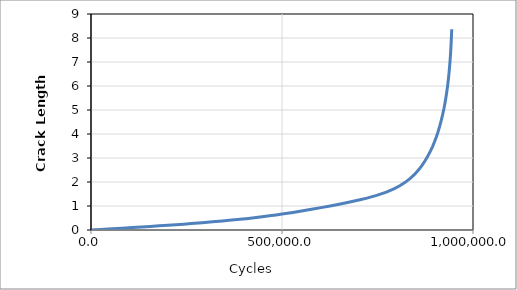
| Category | Series 0 |
|---|---|
| 0.0 | 0 |
| 26012.550499908713 | 0.022 |
| 55534.30999718615 | 0.05 |
| 81782.20482939767 | 0.075 |
| 108126.92658930192 | 0.101 |
| 132466.05350653693 | 0.125 |
| 154861.70012232166 | 0.148 |
| 178417.34925049936 | 0.173 |
| 201290.3176878568 | 0.197 |
| 222457.23201467452 | 0.22 |
| 242745.16798175607 | 0.243 |
| 262159.2345969868 | 0.266 |
| 291049.3199699309 | 0.303 |
| 318126.79382410855 | 0.339 |
| 343761.194375018 | 0.375 |
| 368113.61230577994 | 0.412 |
| 390320.32681070623 | 0.447 |
| 412346.0946539998 | 0.484 |
| 432218.4513562045 | 0.52 |
| 448110.0375029715 | 0.551 |
| 467069.9651072227 | 0.59 |
| 484347.52869853715 | 0.628 |
| 500178.7467167271 | 0.664 |
| 528535.9872325312 | 0.733 |
| 554863.696614153 | 0.802 |
| 581308.58593923 | 0.873 |
| 605787.4793314268 | 0.942 |
| 629718.4611966107 | 1.014 |
| 652650.4719789667 | 1.086 |
| 674414.8182130293 | 1.157 |
| 704175.7588909321 | 1.261 |
| 722334.0298323616 | 1.33 |
| 747801.3628681198 | 1.442 |
| 773169.672937927 | 1.58 |
| 792737.3144612974 | 1.714 |
| 808467.7342661566 | 1.844 |
| 821492.4113012028 | 1.974 |
| 835738.2564782317 | 2.148 |
| 847533.5622840098 | 2.325 |
| 857689.6345287347 | 2.506 |
| 866595.5892198187 | 2.693 |
| 874501.8687954715 | 2.884 |
| 881825.8491184055 | 3.083 |
| 888161.0341516605 | 3.274 |
| 893838.2335105434 | 3.468 |
| 899004.7212595309 | 3.666 |
| 903706.5208049819 | 3.864 |
| 907947.8301900397 | 4.063 |
| 912705.7321298522 | 4.315 |
| 916901.9240951835 | 4.565 |
| 920653.3680120516 | 4.815 |
| 923969.3790623046 | 5.065 |
| 926909.8136471077 | 5.315 |
| 929524.6792357247 | 5.565 |
| 931855.9071375156 | 5.814 |
| 933930.2441745243 | 6.064 |
| 935778.6226354635 | 6.315 |
| 937391.7233345658 | 6.565 |
| 939047.1346284007 | 6.865 |
| 940467.412774081 | 7.165 |
| 941683.4837789072 | 7.466 |
| 942717.3394966408 | 7.766 |
| 943593.648509081 | 8.065 |
| 944330.2237330966 | 8.365 |